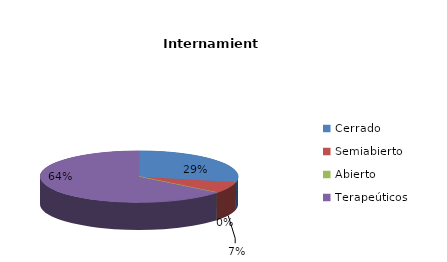
| Category | Series 0 |
|---|---|
| Cerrado | 4 |
| Semiabierto | 1 |
| Abierto | 0 |
| Terapeúticos | 9 |